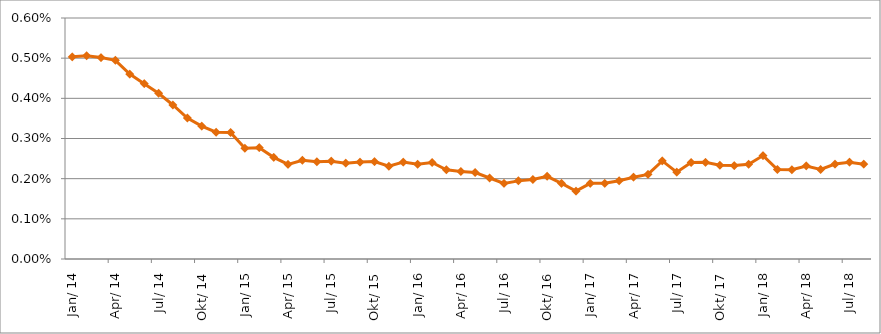
| Category | Durchschnittszins |
|---|---|
| 2014-01-01 | 0.005 |
| 2014-02-01 | 0.005 |
| 2014-03-01 | 0.005 |
| 2014-04-01 | 0.005 |
| 2014-05-01 | 0.005 |
| 2014-06-01 | 0.004 |
| 2014-07-01 | 0.004 |
| 2014-08-01 | 0.004 |
| 2014-09-01 | 0.004 |
| 2014-10-01 | 0.003 |
| 2014-11-01 | 0.003 |
| 2014-12-01 | 0.003 |
| 2015-01-01 | 0.003 |
| 2015-02-01 | 0.003 |
| 2015-03-01 | 0.003 |
| 2015-04-01 | 0.002 |
| 2015-05-01 | 0.002 |
| 2015-06-01 | 0.002 |
| 2015-07-01 | 0.002 |
| 2015-08-01 | 0.002 |
| 2015-09-01 | 0.002 |
| 2015-10-01 | 0.002 |
| 2015-11-01 | 0.002 |
| 2015-12-01 | 0.002 |
| 2016-01-01 | 0.002 |
| 2016-02-01 | 0.002 |
| 2016-03-01 | 0.002 |
| 2016-04-01 | 0.002 |
| 2016-05-01 | 0.002 |
| 2016-06-01 | 0.002 |
| 2016-07-01 | 0.002 |
| 2016-08-01 | 0.002 |
| 2016-09-01 | 0.002 |
| 2016-10-01 | 0.002 |
| 2016-11-01 | 0.002 |
| 2016-12-01 | 0.002 |
| 2017-01-01 | 0.002 |
| 2017-02-01 | 0.002 |
| 2017-03-01 | 0.002 |
| 2017-04-01 | 0.002 |
| 2017-05-01 | 0.002 |
| 2017-06-01 | 0.002 |
| 2017-07-01 | 0.002 |
| 2017-08-01 | 0.002 |
| 2017-09-01 | 0.002 |
| 2017-10-01 | 0.002 |
| 2017-11-01 | 0.002 |
| 2017-12-01 | 0.002 |
| 2018-01-01 | 0.003 |
| 2018-02-01 | 0.002 |
| 2018-03-01 | 0.002 |
| 2018-04-01 | 0.002 |
| 2018-05-01 | 0.002 |
| 2018-06-01 | 0.002 |
| 2018-07-01 | 0.002 |
| 2018-08-01 | 0.002 |